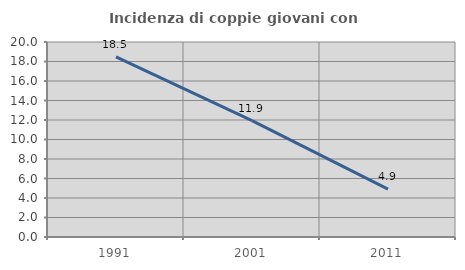
| Category | Incidenza di coppie giovani con figli |
|---|---|
| 1991.0 | 18.484 |
| 2001.0 | 11.93 |
| 2011.0 | 4.917 |